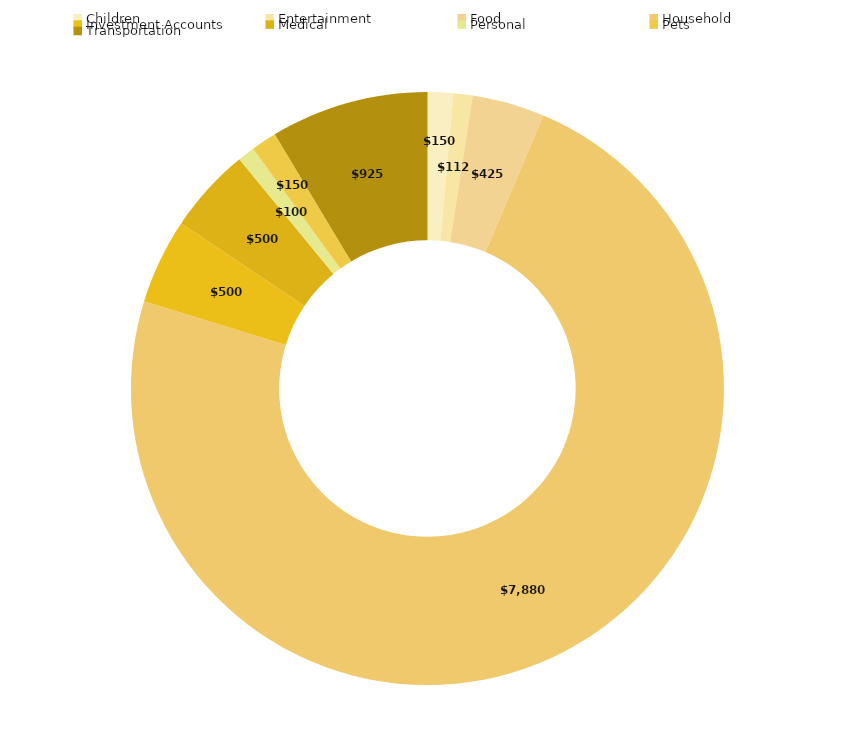
| Category | Total |
|---|---|
| Children | 150 |
| Entertainment | 112 |
| Food | 425 |
| Household | 7880 |
| Investment Accounts | 500 |
| Medical | 500 |
| Personal | 100 |
| Pets | 150 |
| Transportation | 925 |